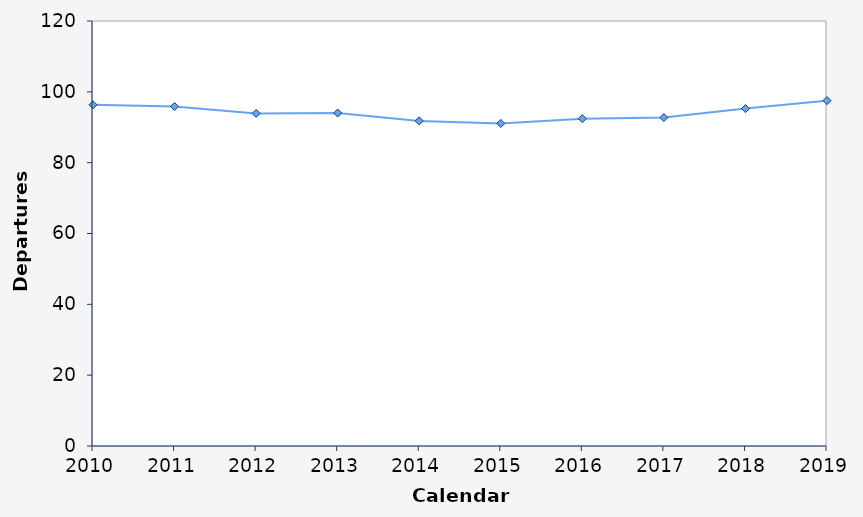
| Category | Departures (100,000s) |
|---|---|
| 2010.0 | 96.338 |
| 2011.0 | 95.839 |
| 2012.0 | 93.907 |
| 2013.0 | 94.019 |
| 2014.0 | 91.787 |
| 2015.0 | 91.072 |
| 2016.0 | 92.43 |
| 2017.0 | 92.742 |
| 2018.0 | 95.262 |
| 2019.0 | 97.515 |